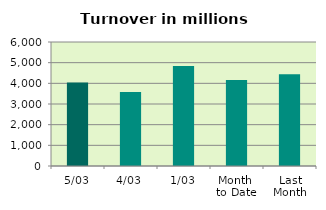
| Category | Series 0 |
|---|---|
| 5/03 | 4043.316 |
| 4/03 | 3584.914 |
| 1/03 | 4838.813 |
| Month 
to Date | 4155.681 |
| Last
Month | 4438.793 |